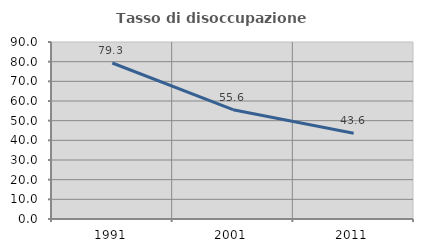
| Category | Tasso di disoccupazione giovanile  |
|---|---|
| 1991.0 | 79.321 |
| 2001.0 | 55.581 |
| 2011.0 | 43.622 |